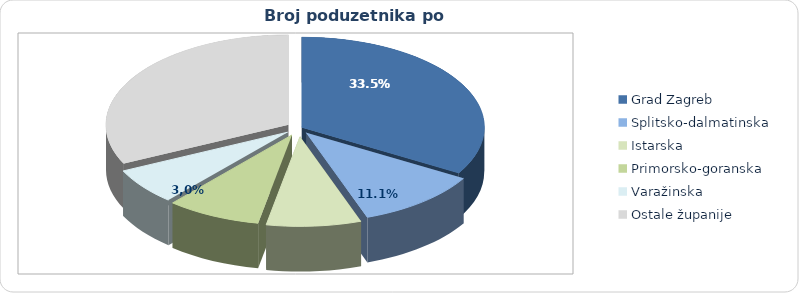
| Category | Broj poduzetnika |
|---|---|
| Grad Zagreb | 43927 |
| Splitsko-dalmatinska | 14518 |
| Istarska | 11006 |
| Primorsko-goranska | 10974 |
| Varažinska | 8589 |
| Ostale županije | 42103 |